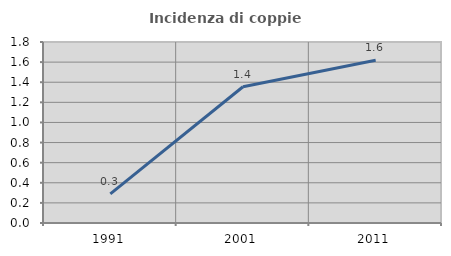
| Category | Incidenza di coppie miste |
|---|---|
| 1991.0 | 0.289 |
| 2001.0 | 1.355 |
| 2011.0 | 1.618 |